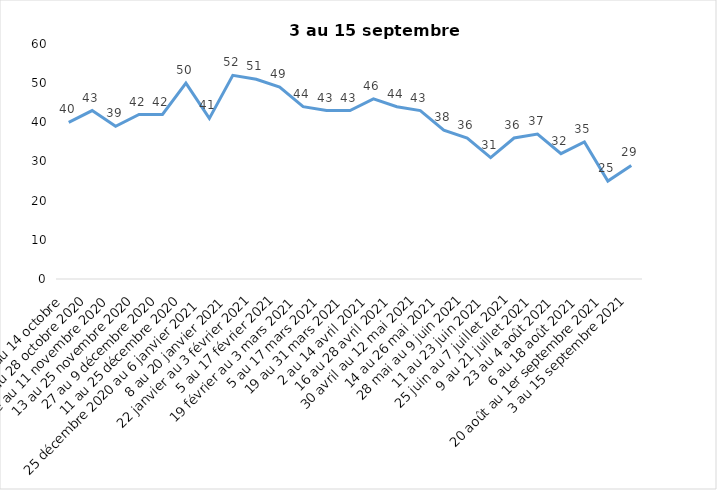
| Category | Toujours aux trois mesures |
|---|---|
| 2 au 14 octobre  | 40 |
| 16 au 28 octobre 2020 | 43 |
| 30 octobre au 11 novembre 2020 | 39 |
| 13 au 25 novembre 2020 | 42 |
| 27 au 9 décembre 2020 | 42 |
| 11 au 25 décembre 2020 | 50 |
| 25 décembre 2020 au 6 janvier 2021 | 41 |
| 8 au 20 janvier 2021 | 52 |
| 22 janvier au 3 février 2021 | 51 |
| 5 au 17 février 2021 | 49 |
| 19 février au 3 mars 2021 | 44 |
| 5 au 17 mars 2021 | 43 |
| 19 au 31 mars 2021 | 43 |
| 2 au 14 avril 2021 | 46 |
| 16 au 28 avril 2021 | 44 |
| 30 avril au 12 mai 2021 | 43 |
| 14 au 26 mai 2021 | 38 |
| 28 mai au 9 juin 2021 | 36 |
| 11 au 23 juin 2021 | 31 |
| 25 juin au 7 juillet 2021 | 36 |
| 9 au 21 juillet 2021 | 37 |
| 23 au 4 août 2021 | 32 |
| 6 au 18 août 2021 | 35 |
| 20 août au 1er septembre 2021 | 25 |
| 3 au 15 septembre 2021 | 29 |